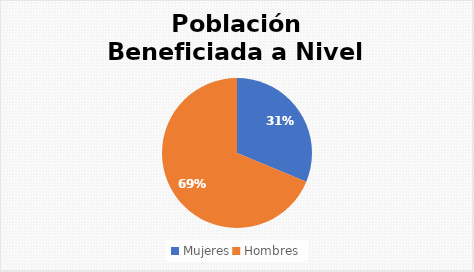
| Category | Series 0 |
|---|---|
| Mujeres | 30 |
| Hombres | 66 |